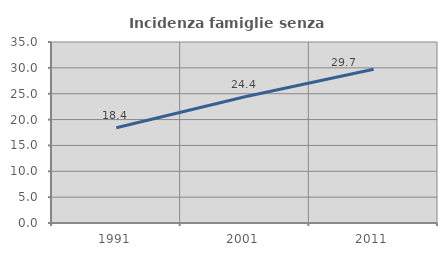
| Category | Incidenza famiglie senza nuclei |
|---|---|
| 1991.0 | 18.421 |
| 2001.0 | 24.397 |
| 2011.0 | 29.718 |